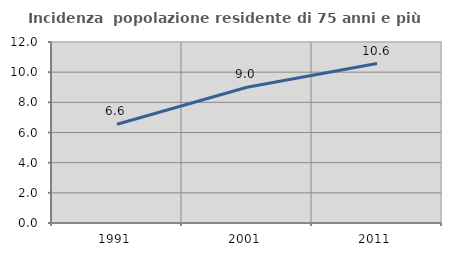
| Category | Incidenza  popolazione residente di 75 anni e più |
|---|---|
| 1991.0 | 6.55 |
| 2001.0 | 9.002 |
| 2011.0 | 10.572 |